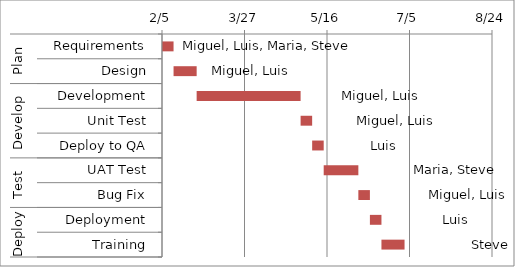
| Category | Duration Filler | Duration (Days) |
|---|---|---|
| 0 | 2/5/18 | 7 |
| 1 | 2/12/18 | 14 |
| 2 | 2/26/18 | 63 |
| 3 | 4/30/18 | 7 |
| 4 | 5/7/18 | 7 |
| 5 | 5/14/18 | 21 |
| 6 | 6/4/18 | 7 |
| 7 | 6/11/18 | 7 |
| 8 | 6/18/18 | 14 |